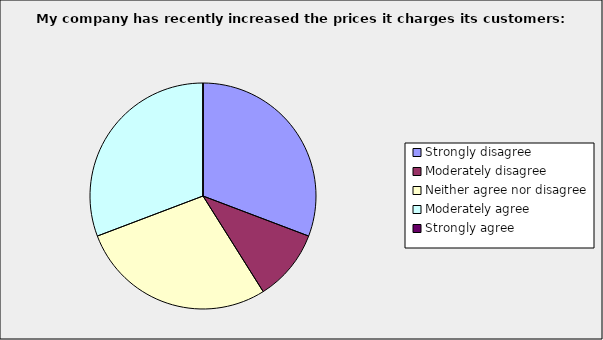
| Category | Series 0 |
|---|---|
| Strongly disagree | 0.308 |
| Moderately disagree | 0.103 |
| Neither agree nor disagree | 0.282 |
| Moderately agree | 0.308 |
| Strongly agree | 0 |